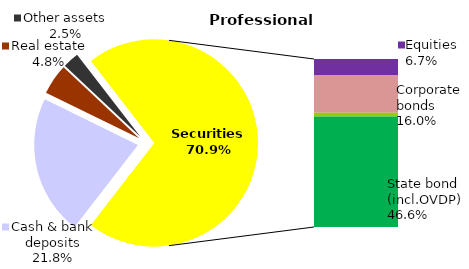
| Category | Professional |
|---|---|
| Cash & bank deposits | 31.977 |
| Bank metals | 0 |
| Real estate | 7.006 |
| Other assets | 3.725 |
| Equities | 9.868 |
| Corporate bonds | 23.446 |
| Municipal bonds | 2.377 |
| State bond (incl.OVDP) | 68.48 |